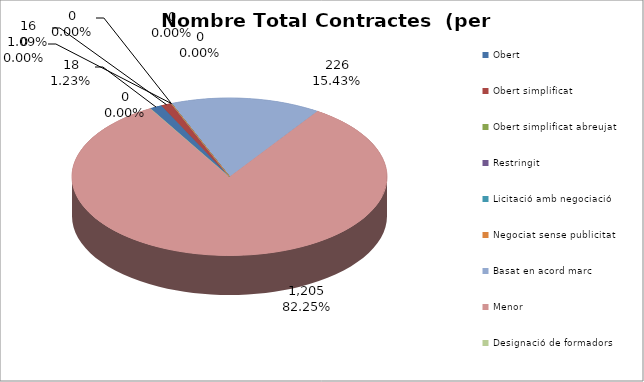
| Category | Nombre Total Contractes |
|---|---|
| Obert | 18 |
| Obert simplificat | 16 |
| Obert simplificat abreujat | 0 |
| Restringit | 0 |
| Licitació amb negociació | 0 |
| Negociat sense publicitat | 0 |
| Basat en acord marc | 226 |
| Menor | 1205 |
| Designació de formadors | 0 |